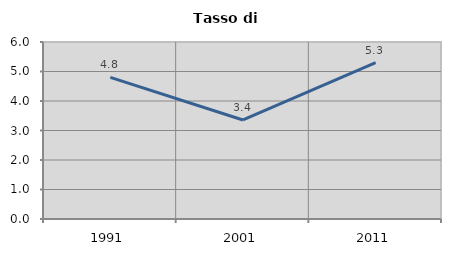
| Category | Tasso di disoccupazione   |
|---|---|
| 1991.0 | 4.803 |
| 2001.0 | 3.357 |
| 2011.0 | 5.301 |